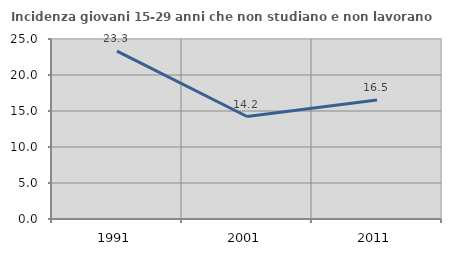
| Category | Incidenza giovani 15-29 anni che non studiano e non lavorano  |
|---|---|
| 1991.0 | 23.323 |
| 2001.0 | 14.232 |
| 2011.0 | 16.529 |